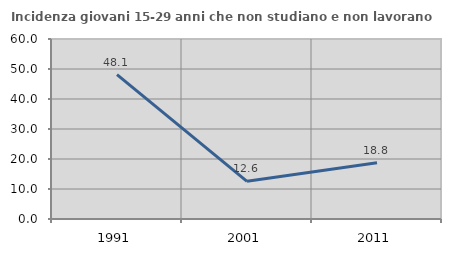
| Category | Incidenza giovani 15-29 anni che non studiano e non lavorano  |
|---|---|
| 1991.0 | 48.111 |
| 2001.0 | 12.552 |
| 2011.0 | 18.75 |